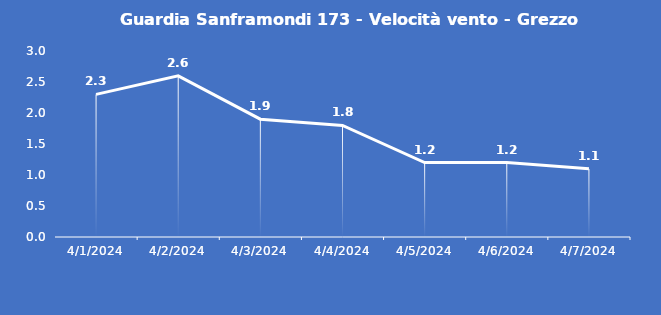
| Category | Guardia Sanframondi 173 - Velocità vento - Grezzo (m/s) |
|---|---|
| 4/1/24 | 2.3 |
| 4/2/24 | 2.6 |
| 4/3/24 | 1.9 |
| 4/4/24 | 1.8 |
| 4/5/24 | 1.2 |
| 4/6/24 | 1.2 |
| 4/7/24 | 1.1 |